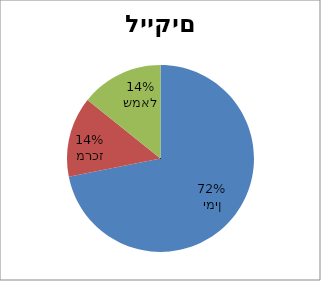
| Category | לייקים |
|---|---|
| ימין | 362894 |
| מרכז | 70018 |
| שמאל | 71971 |